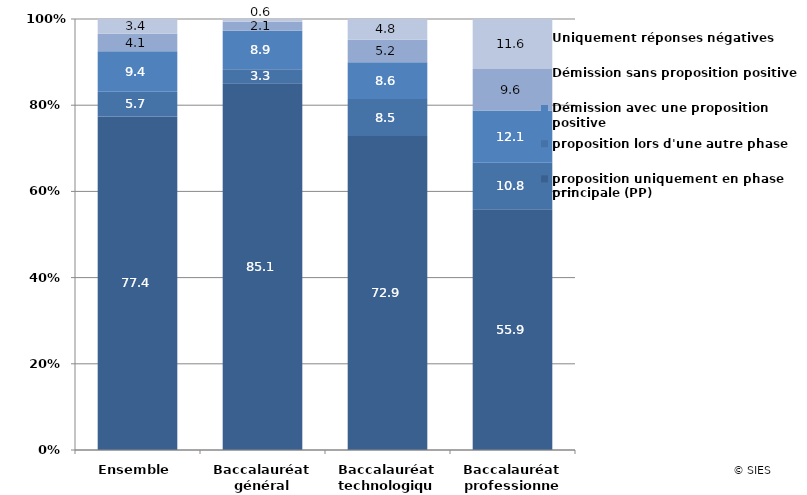
| Category | proposition uniquement en phase principale (PP) | proposition lors d'une autre phase | Démission avec une proposition positive | Démission sans proposition positive | Uniquement réponses négatives |
|---|---|---|---|---|---|
| Ensemble | 77.383 | 5.732 | 9.375 | 4.08 | 3.429 |
| Baccalauréat général | 85.095 | 3.267 | 8.915 | 2.104 | 0.619 |
| Baccalauréat technologique | 72.873 | 8.543 | 8.552 | 5.201 | 4.831 |
| Baccalauréat professionnel | 55.85 | 10.789 | 12.115 | 9.645 | 11.601 |